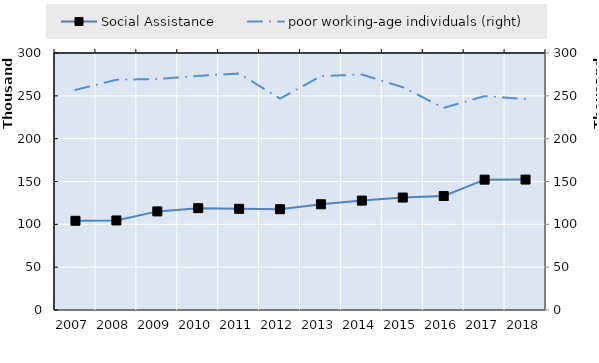
| Category | Social Assistance | 0 | Series 14 | Series 15 | Series 16 | Series 17 | Series 18 | Series 19 |
|---|---|---|---|---|---|---|---|---|
| 2007.0 | 104117 |  |  |  |  |  |  |  |
| 2008.0 | 104530 |  |  |  |  |  |  |  |
| 2009.0 | 115105 |  |  |  |  |  |  |  |
| 2010.0 | 118886 |  |  |  |  |  |  |  |
| 2011.0 | 118133 |  |  |  |  |  |  |  |
| 2012.0 | 117667 |  |  |  |  |  |  |  |
| 2013.0 | 123456 |  |  |  |  |  |  |  |
| 2014.0 | 127710 |  |  |  |  |  |  |  |
| 2015.0 | 131271 |  |  |  |  |  |  |  |
| 2016.0 | 133061 |  |  |  |  |  |  |  |
| 2017.0 | 152142 |  |  |  |  |  |  |  |
| 2018.0 | 152253 |  |  |  |  |  |  |  |